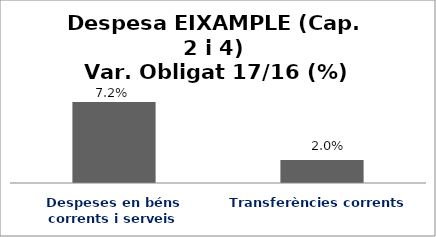
| Category | Series 0 |
|---|---|
| Despeses en béns corrents i serveis | 0.072 |
| Transferències corrents | 0.02 |